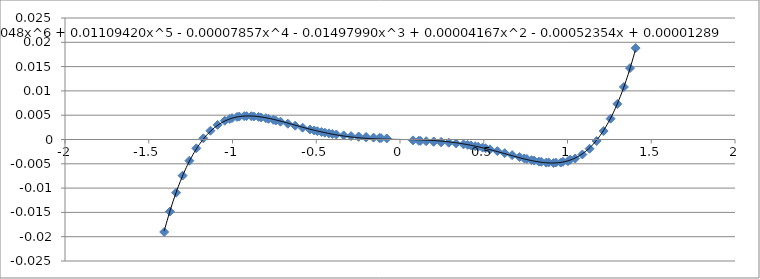
| Category | Series 0 |
|---|---|
| 1.406968 | 0.019 |
| 1.373006 | 0.015 |
| 1.336391 | 0.011 |
| 1.297589 | 0.007 |
| 1.257222 | 0.004 |
| 1.215843 | 0.002 |
| 1.173861 | 0 |
| 1.131479 | -0.002 |
| 1.088804 | -0.003 |
| 1.045918 | -0.004 |
| 1.002823 | -0.004 |
| 0.959581 | -0.005 |
| 0.916209 | -0.005 |
| 0.87272 | -0.005 |
| 0.829122 | -0.005 |
| 0.785379 | -0.004 |
| 0.741527 | -0.004 |
| -1.407642 | -0.019 |
| -1.373557 | -0.015 |
| -1.336845 | -0.011 |
| -1.297966 | -0.007 |
| -1.257536 | -0.004 |
| -1.216107 | -0.002 |
| -1.174085 | 0 |
| -1.13167 | 0.002 |
| -1.088966 | 0.003 |
| -1.046054 | 0.004 |
| -1.002936 | 0.004 |
| -0.959673 | 0.005 |
| -0.916281 | 0.005 |
| -0.872774 | 0.005 |
| -0.829159 | 0.005 |
| -0.785401 | 0.004 |
| -0.741536 | 0.004 |
| 1.016165 | -0.004 |
| 0.972952 | -0.005 |
| 0.930159 | -0.005 |
| 0.887199 | -0.005 |
| 0.84399 | -0.005 |
| 0.80061 | -0.004 |
| 0.757055 | -0.004 |
| 0.713323 | -0.004 |
| 0.669466 | -0.003 |
| 0.625449 | -0.003 |
| 0.581338 | -0.002 |
| 0.537125 | -0.002 |
| 0.492797 | -0.002 |
| 0.448408 | -0.001 |
| 0.40391 | -0.001 |
| -1.016338 | 0.004 |
| -0.973134 | 0.005 |
| -0.930356 | 0.005 |
| -0.887404 | 0.005 |
| -0.844199 | 0.005 |
| -0.800818 | 0.004 |
| -0.75726 | 0.004 |
| -0.713522 | 0.004 |
| -0.669656 | 0.003 |
| -0.625629 | 0.003 |
| -0.581507 | 0.002 |
| -0.537284 | 0.002 |
| -0.492944 | 0.002 |
| -0.448545 | 0.001 |
| -0.404037 | 0.001 |
| 0.510957 | -0.002 |
| 0.4667 | -0.001 |
| 0.422983 | -0.001 |
| 0.379145 | -0.001 |
| 0.335138 | -0.001 |
| 0.290971 | -0.001 |
| 0.246671 | -0.001 |
| 0.202252 | 0 |
| -0.512125 | 0.002 |
| -0.467913 | 0.002 |
| -0.424168 | 0.001 |
| -0.380261 | 0.001 |
| -0.336171 | 0.001 |
| -0.291915 | 0.001 |
| -0.247524 | 0.001 |
| -0.203025 | 0 |
| 0.24451 | -0.001 |
| 0.20031 | 0 |
| 0.156426 | 0 |
| 0.112313 | 0 |
| -0.246001 | 0.001 |
| -0.20176 | 0 |
| -0.157721 | 0 |
| -0.113456 | 0 |
| 0.121464 | 0 |
| 0.077448 | 0 |
| -0.123135 | 0 |
| -0.078911 | 0 |